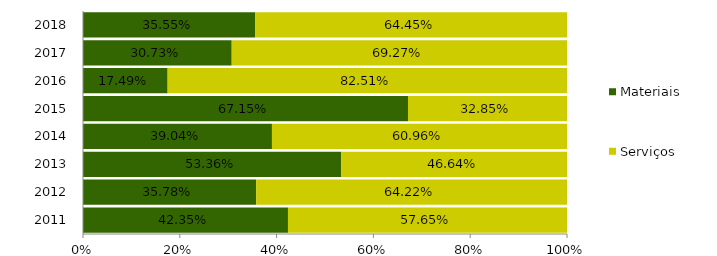
| Category | Materiais | Serviços |
|---|---|---|
| 2011.0 | 0.423 | 0.577 |
| 2012.0 | 0.358 | 0.642 |
| 2013.0 | 0.534 | 0.466 |
| 2014.0 | 0.39 | 0.61 |
| 2015.0 | 0.671 | 0.329 |
| 2016.0 | 0.175 | 0.825 |
| 2017.0 | 0.307 | 0.693 |
| 2018.0 | 0.355 | 0.645 |